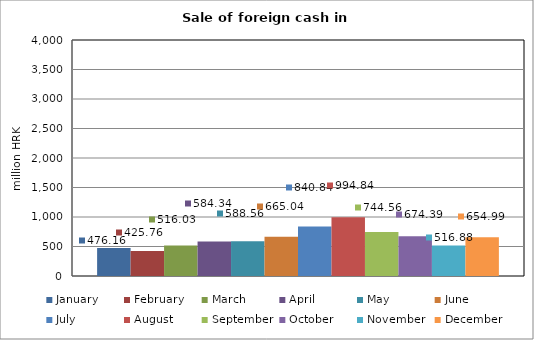
| Category | January | February | March | April | May | June | July | August | September | October | November | December |
|---|---|---|---|---|---|---|---|---|---|---|---|---|
| 0 | 476.16 | 425.763 | 516.03 | 584.338 | 588.561 | 665.041 | 840.841 | 994.839 | 744.556 | 674.389 | 516.878 | 654.986 |